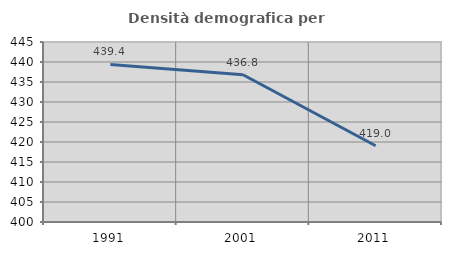
| Category | Densità demografica |
|---|---|
| 1991.0 | 439.402 |
| 2001.0 | 436.813 |
| 2011.0 | 419.05 |